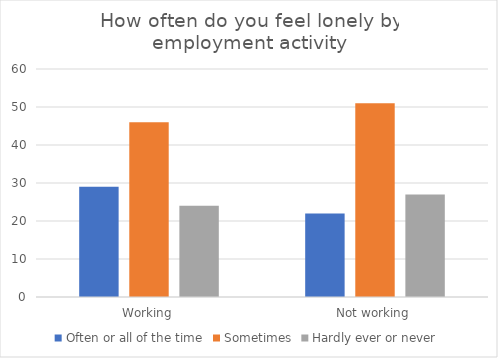
| Category | Often or all of the time | Sometimes | Hardly ever or never |
|---|---|---|---|
| Working | 29 | 46 | 24 |
| Not working | 22 | 51 | 27 |